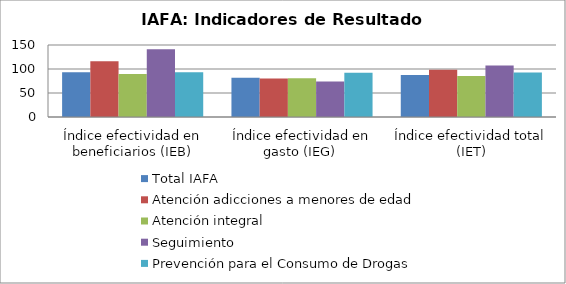
| Category | Total IAFA | Atención adicciones a menores de edad | Atención integral  | Seguimiento | Prevención para el Consumo de Drogas |
|---|---|---|---|---|---|
| Índice efectividad en beneficiarios (IEB) | 93.265 | 116.162 | 89.583 | 141.176 | 93.011 |
| Índice efectividad en gasto (IEG)  | 81.979 | 80.29 | 80.781 | 73.732 | 92.078 |
| Índice efectividad total (IET) | 87.622 | 98.226 | 85.182 | 107.454 | 92.545 |